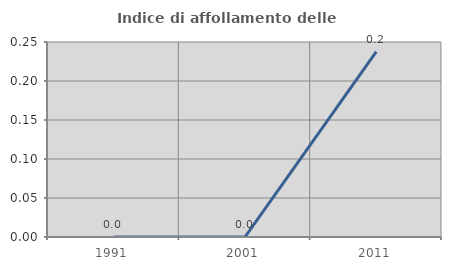
| Category | Indice di affollamento delle abitazioni  |
|---|---|
| 1991.0 | 0 |
| 2001.0 | 0 |
| 2011.0 | 0.238 |